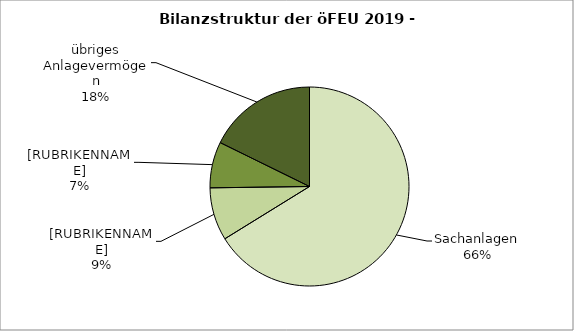
| Category | Series 0 |
|---|---|
| Sachanlagen | 66.191 |
| übriges Umlaufvermögen übrige Aktiva | 8.592 |
| Forderungen | 7.487 |
| übriges Anlagevermögen | 17.73 |